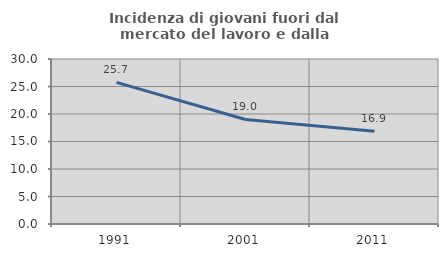
| Category | Incidenza di giovani fuori dal mercato del lavoro e dalla formazione  |
|---|---|
| 1991.0 | 25.74 |
| 2001.0 | 19.003 |
| 2011.0 | 16.877 |